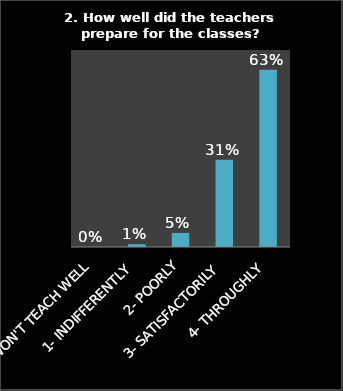
| Category | Series 0 |
|---|---|
| 0- WON'T TEACH WELL | 0 |
| 1- INDIFFERENTLY | 0.01 |
| 2- POORLY | 0.05 |
| 3- SATISFACTORILY | 0.31 |
| 4- THROUGHLY | 0.63 |